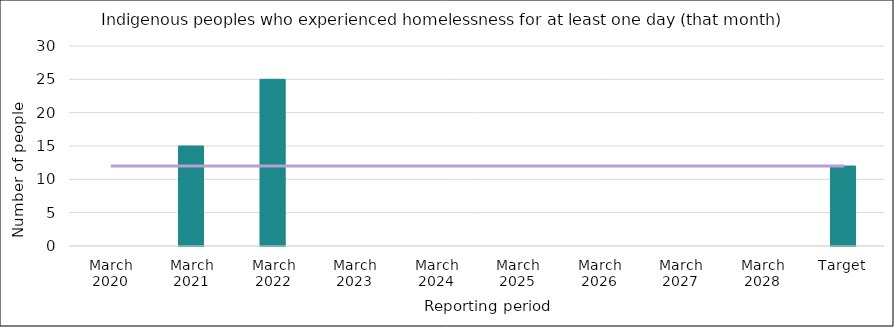
| Category | Series 0 |
|---|---|
| March 2020 | 0 |
| March 2021 | 15 |
| March 2022 | 25 |
| March 2023 | 0 |
| March 2024 | 0 |
| March 2025 | 0 |
| March 2026 | 0 |
| March 2027 | 0 |
| March 2028 | 0 |
| Target | 12 |